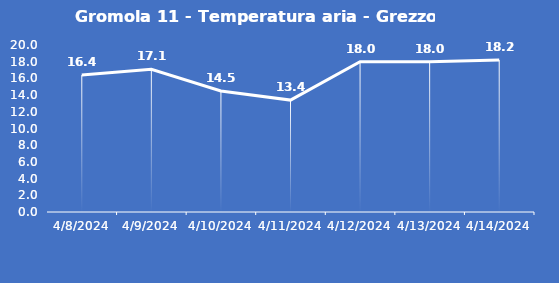
| Category | Gromola 11 - Temperatura aria - Grezzo (°C) |
|---|---|
| 4/8/24 | 16.4 |
| 4/9/24 | 17.1 |
| 4/10/24 | 14.5 |
| 4/11/24 | 13.4 |
| 4/12/24 | 18 |
| 4/13/24 | 18 |
| 4/14/24 | 18.2 |